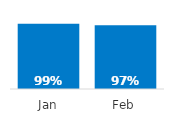
| Category | On time Delivery |
|---|---|
| Jan | 0.99 |
| Feb | 0.97 |